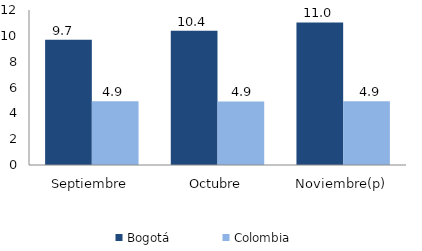
| Category | Bogotá | Colombia |
|---|---|---|
| Septiembre | 9.695 | 4.927 |
| Octubre | 10.387 | 4.916 |
| Noviembre(p) | 11.042 | 4.928 |